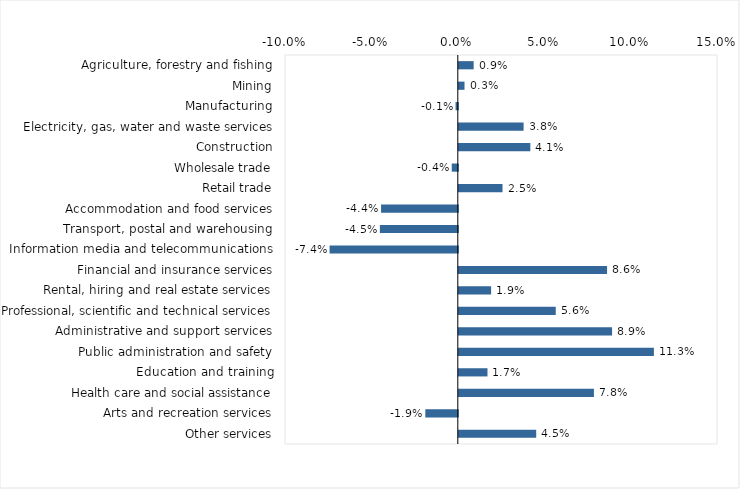
| Category | This week |
|---|---|
| Agriculture, forestry and fishing | 0.009 |
| Mining | 0.003 |
| Manufacturing | -0.001 |
| Electricity, gas, water and waste services | 0.038 |
| Construction | 0.041 |
| Wholesale trade | -0.004 |
| Retail trade | 0.025 |
| Accommodation and food services | -0.044 |
| Transport, postal and warehousing | -0.045 |
| Information media and telecommunications | -0.074 |
| Financial and insurance services | 0.086 |
| Rental, hiring and real estate services | 0.019 |
| Professional, scientific and technical services | 0.056 |
| Administrative and support services | 0.089 |
| Public administration and safety | 0.113 |
| Education and training | 0.017 |
| Health care and social assistance | 0.078 |
| Arts and recreation services | -0.019 |
| Other services | 0.045 |